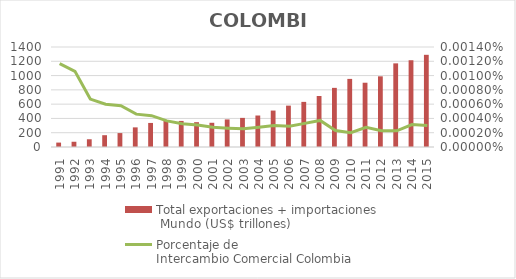
| Category | Total exportaciones + importaciones
 Mundo (US$ trillones) |
|---|---|
| 1991.0 | 61.773 |
| 1992.0 | 73.498 |
| 1993.0 | 108.328 |
| 1994.0 | 165.228 |
| 1995.0 | 194.957 |
| 1996.0 | 274.809 |
| 1997.0 | 336.801 |
| 1998.0 | 369.288 |
| 1999.0 | 364.994 |
| 2000.0 | 347.676 |
| 2001.0 | 339.145 |
| 2002.0 | 386.168 |
| 2003.0 | 407.578 |
| 2004.0 | 440.831 |
| 2005.0 | 510.047 |
| 2006.0 | 579.259 |
| 2007.0 | 631.733 |
| 2008.0 | 713.989 |
| 2009.0 | 827.927 |
| 2010.0 | 953.458 |
| 2011.0 | 899.811 |
| 2012.0 | 989.416 |
| 2013.0 | 1170.893 |
| 2014.0 | 1214.619 |
| 2015.0 | 1290.663 |